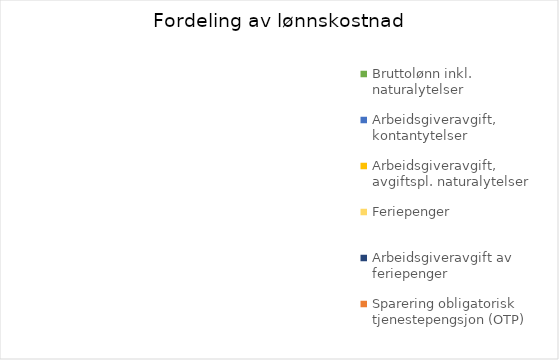
| Category | Series 0 |
|---|---|
| Bruttolønn inkl. naturalytelser   | 0 |
| Arbeidsgiveravgift, kontantytelser | 0 |
| Arbeidsgiveravgift, avgiftspl. naturalytelser | 0 |
| Feriepenger | 0 |
| Arbeidsgiveravgift av feriepenger | 0 |
| Sparering obligatorisk tjenestepengsjon (OTP) | 0 |